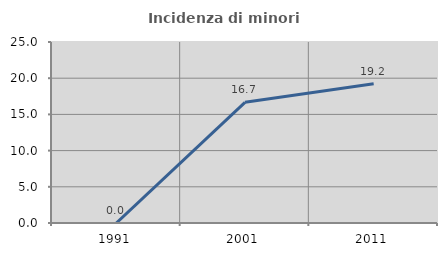
| Category | Incidenza di minori stranieri |
|---|---|
| 1991.0 | 0 |
| 2001.0 | 16.667 |
| 2011.0 | 19.231 |